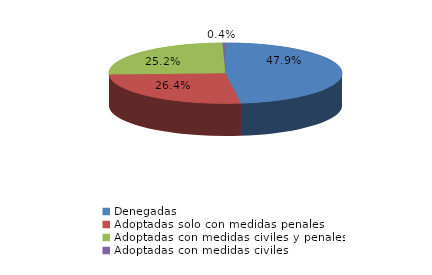
| Category | Series 0 |
|---|---|
| Denegadas | 2414 |
| Adoptadas solo con medidas penales | 1331 |
| Adoptadas con medidas civiles y penales | 1272 |
| Adoptadas con medidas civiles | 21 |